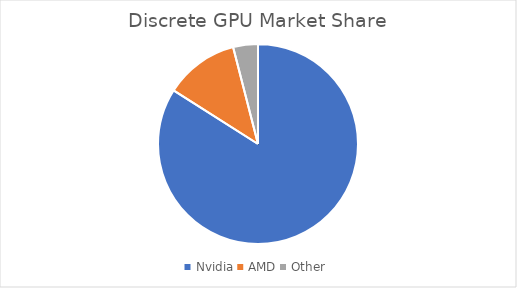
| Category | Discrete GPU Market Share |
|---|---|
| Nvidia | 0.84 |
| AMD | 0.12 |
| Other | 0.04 |